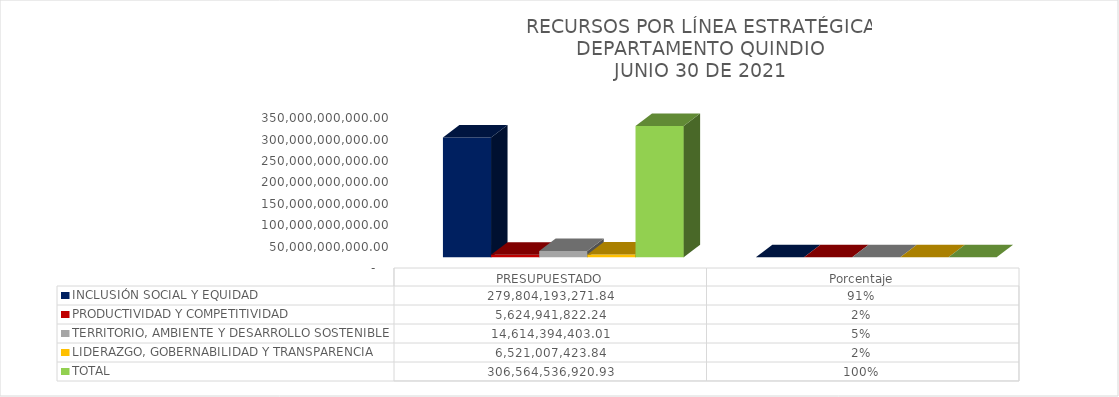
| Category | INCLUSIÓN SOCIAL Y EQUIDAD  | PRODUCTIVIDAD Y COMPETITIVIDAD | TERRITORIO, AMBIENTE Y DESARROLLO SOSTENIBLE  | LIDERAZGO, GOBERNABILIDAD Y TRANSPARENCIA  | TOTAL |
|---|---|---|---|---|---|
| PRESUPUESTADO | 279804193271.84 | 5624941822.24 | 14614394403.01 | 6521007423.84 | 306564536920.93 |
| Porcentaje | 0.913 | 0.018 | 0.048 | 0.021 | 1 |